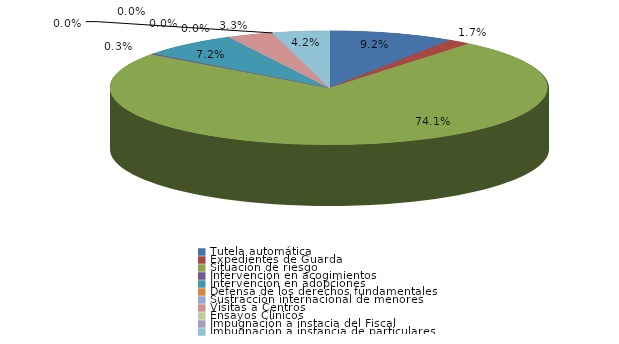
| Category | Series 0 |
|---|---|
| Tutela automática | 33 |
| Expedientes de Guarda | 6 |
| Situación de riesgo | 266 |
| Intervención en acogimientos | 1 |
| Intervención en adopciones | 26 |
| Defensa de los derechos fundamentales | 0 |
| Sustracción internacional de menores | 0 |
| Visitas a Centros | 12 |
| Ensayos Clínicos | 0 |
| Impugnación a instacia del Fiscal | 0 |
| Impugnación a instancia de particulares | 15 |